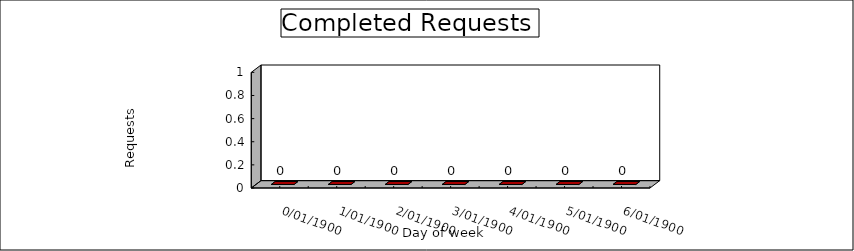
| Category | Completed on same day |
|---|---|
| 0 | 0 |
| 1900-01-01 | 0 |
| 1900-01-02 | 0 |
| 1900-01-03 | 0 |
| 1900-01-04 | 0 |
| 1900-01-05 | 0 |
| 1900-01-06 | 0 |